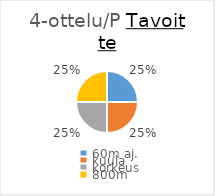
| Category | Series 0 |
|---|---|
| 60m aj. | 1000 |
| kuula | 1000 |
| korkeus | 1000 |
| 800m | 1000 |